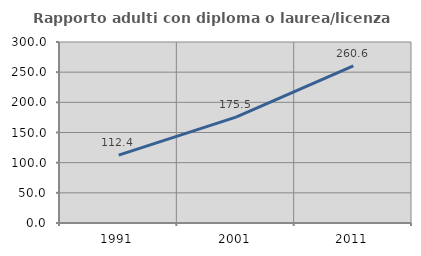
| Category | Rapporto adulti con diploma o laurea/licenza media  |
|---|---|
| 1991.0 | 112.426 |
| 2001.0 | 175.508 |
| 2011.0 | 260.617 |